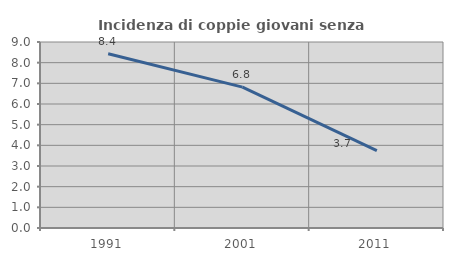
| Category | Incidenza di coppie giovani senza figli |
|---|---|
| 1991.0 | 8.432 |
| 2001.0 | 6.815 |
| 2011.0 | 3.746 |